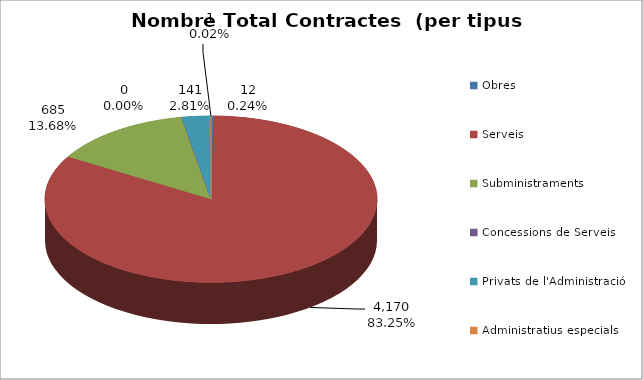
| Category | Nombre Total Contractes |
|---|---|
| Obres | 12 |
| Serveis | 4170 |
| Subministraments | 685 |
| Concessions de Serveis | 0 |
| Privats de l'Administració | 141 |
| Administratius especials | 1 |